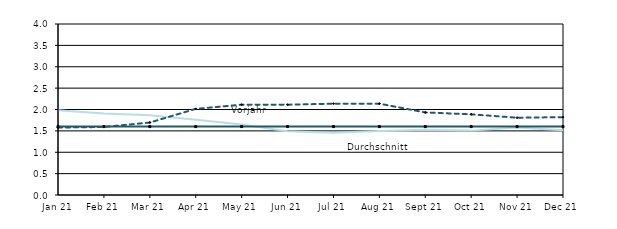
| Category | Berichtsjahr | Durchschnitt | Vorjahr |
|---|---|---|---|
| 2021-01-01 | 1.985 | 1.6 | 1.577 |
| 2021-02-01 | 1.908 | 1.6 | 1.592 |
| 2021-03-01 | 1.864 | 1.6 | 1.695 |
| 2021-04-01 | 1.763 | 1.6 | 2.015 |
| 2021-05-01 | 1.647 | 1.6 | 2.112 |
| 2021-06-01 | 1.491 | 1.6 | 2.112 |
| 2021-07-01 | 1.457 | 1.6 | 2.137 |
| 2021-08-01 | 1.496 | 1.6 | 2.137 |
| 2021-09-01 | 1.525 | 1.6 | 1.931 |
| 2021-10-01 | 1.506 | 1.6 | 1.887 |
| 2021-11-01 | 1.579 | 1.6 | 1.808 |
| 2021-12-01 | 1.512 | 1.6 | 1.821 |